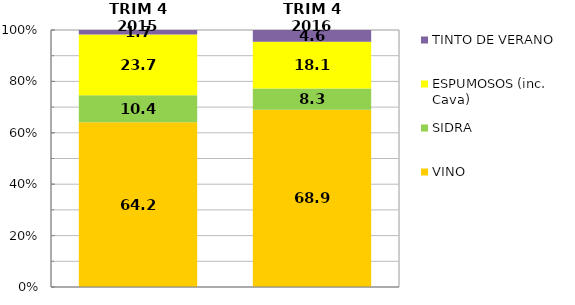
| Category | VINO | SIDRA | ESPUMOSOS (inc. Cava) | TINTO DE VERANO |
|---|---|---|---|---|
| TRIM 4 2015 | 64.152 | 10.441 | 23.691 | 1.716 |
| TRIM 4 2016 | 68.934 | 8.31 | 18.138 | 4.619 |